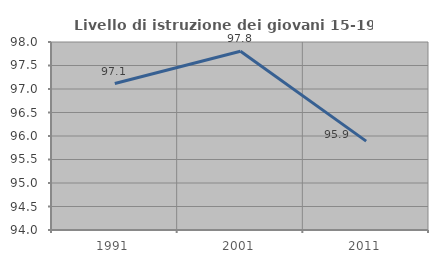
| Category | Livello di istruzione dei giovani 15-19 anni |
|---|---|
| 1991.0 | 97.115 |
| 2001.0 | 97.802 |
| 2011.0 | 95.89 |